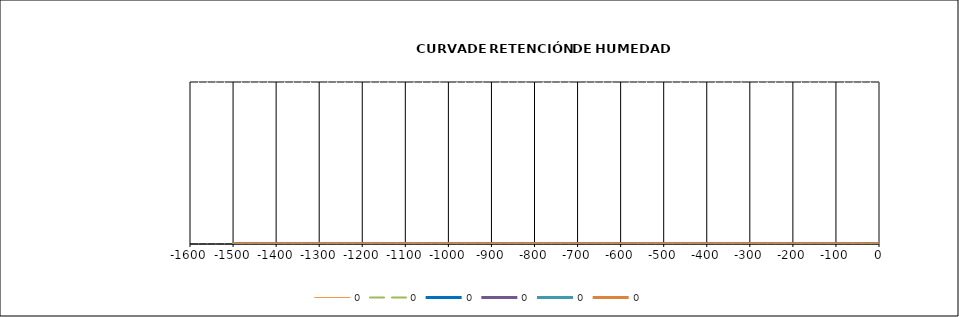
| Category | 0 |
|---|---|
| 0.0 | 0 |
| -33.0 | 0 |
| -100.0 | 0 |
| -500.0 | 0 |
| -1500.0 | 0 |